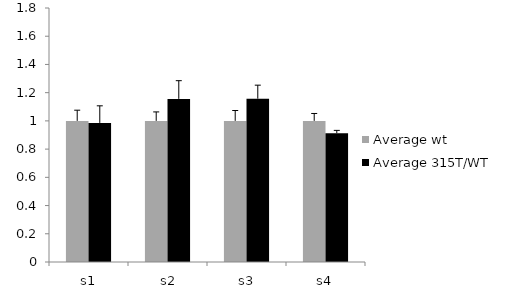
| Category | Average wt | Average 315T/WT |
|---|---|---|
|  s1 | 1 | 0.986 |
|  s2 | 1 | 1.156 |
|  s3 | 1 | 1.157 |
| s4 | 1 | 0.913 |